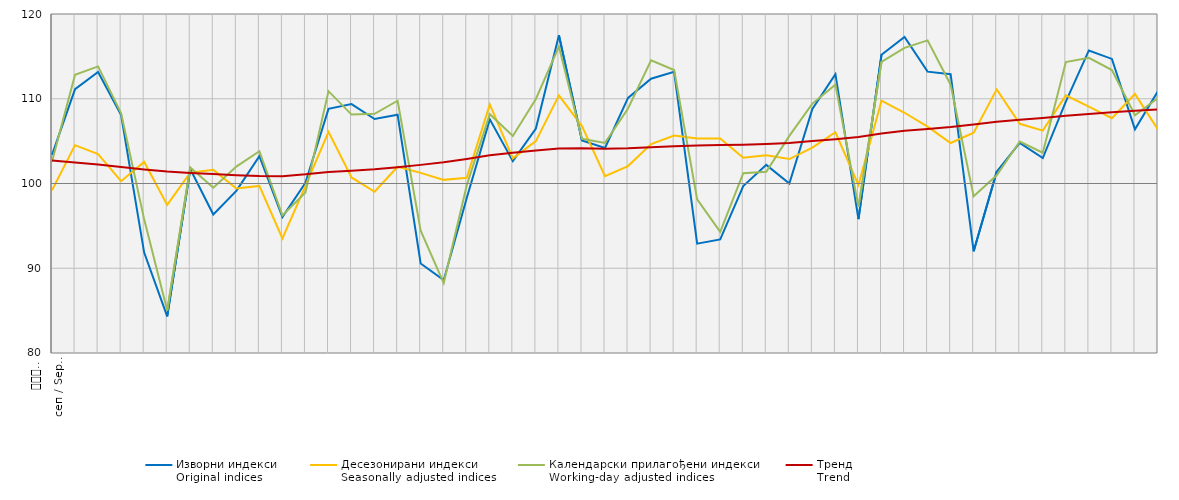
| Category | Изворни индекси
Original indices | Десезонирани индекси
Seasonally adjusted indices | Календарски прилагођени индекси
Working-day adjusted indices | Тренд
Trend |
|---|---|---|---|---|
| 0 | 103.369 | 99.195 | 102.586 | 102.707 |
| 1 | 111.125 | 104.524 | 112.828 | 102.489 |
| 2 | 113.167 | 103.463 | 113.814 | 102.233 |
| 3 | 108.083 | 100.277 | 108.288 | 101.933 |
| 4 | 91.849 | 102.548 | 95.771 | 101.661 |
| 5 | 84.325 | 97.477 | 85.003 | 101.407 |
| 6 | 101.706 | 101.271 | 101.899 | 101.249 |
| 7 | 96.339 | 101.609 | 99.503 | 101.118 |
| 8 | 99.133 | 99.416 | 102 | 100.978 |
| 9 | 103.214 | 99.714 | 103.804 | 100.873 |
| 10 | 96.046 | 93.511 | 96.229 | 100.861 |
| 11 | 100.071 | 99.724 | 98.936 | 101.078 |
| 12 | 108.809 | 106.1 | 110.897 | 101.358 |
| 13 | 109.371 | 100.714 | 108.131 | 101.506 |
| 14 | 107.609 | 99.025 | 108.224 | 101.67 |
| 15 | 108.112 | 101.98 | 109.769 | 101.923 |
| 16 | 90.559 | 101.255 | 94.426 | 102.197 |
| 17 | 88.596 | 100.428 | 88.248 | 102.495 |
| 18 | 98.288 | 100.666 | 99.794 | 102.896 |
| 19 | 107.567 | 109.338 | 108.182 | 103.326 |
| 20 | 102.635 | 102.968 | 105.604 | 103.622 |
| 21 | 106.478 | 105.005 | 109.975 | 103.893 |
| 22 | 117.488 | 110.407 | 116.155 | 104.129 |
| 23 | 105.073 | 106.779 | 105.273 | 104.161 |
| 24 | 104.198 | 100.859 | 104.794 | 104.109 |
| 25 | 110.096 | 102.058 | 108.848 | 104.155 |
| 26 | 112.368 | 104.661 | 114.525 | 104.285 |
| 27 | 113.169 | 105.651 | 113.385 | 104.404 |
| 28 | 92.9 | 105.303 | 98.124 | 104.487 |
| 29 | 93.4 | 105.313 | 94.288 | 104.535 |
| 30 | 99.7 | 103.044 | 101.21 | 104.571 |
| 31 | 102.2 | 103.345 | 101.382 | 104.653 |
| 32 | 100 | 102.882 | 105.623 | 104.793 |
| 33 | 108.8 | 104.242 | 109.428 | 105.009 |
| 34 | 112.9 | 106.049 | 111.664 | 105.235 |
| 35 | 95.8 | 99.817 | 97.248 | 105.497 |
| 36 | 115.2 | 109.775 | 114.348 | 105.886 |
| 37 | 117.3 | 108.347 | 115.999 | 106.215 |
| 38 | 113.2 | 106.713 | 116.885 | 106.439 |
| 39 | 112.9 | 104.775 | 111.66 | 106.671 |
| 40 | 92 | 106.001 | 98.485 | 106.97 |
| 41 | 101.4 | 111.108 | 100.962 | 107.288 |
| 42 | 104.8 | 107.04 | 104.954 | 107.51 |
| 43 | 103 | 106.237 | 103.632 | 107.736 |
| 44 | 109.651 | 110.401 | 114.333 | 108.006 |
| 45 | 115.698 | 109.082 | 114.821 | 108.212 |
| 46 | 114.7 | 107.706 | 113.38 | 108.393 |
| 47 | 106.4 | 110.565 | 108.058 | 108.576 |
| 48 | 110.9 | 106.345 | 110.084 | 108.73 |